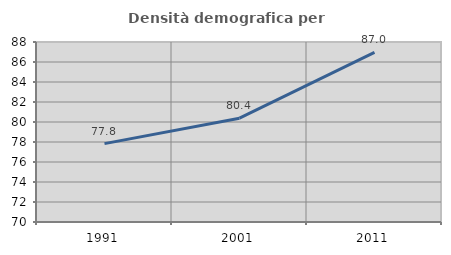
| Category | Densità demografica |
|---|---|
| 1991.0 | 77.838 |
| 2001.0 | 80.383 |
| 2011.0 | 86.97 |